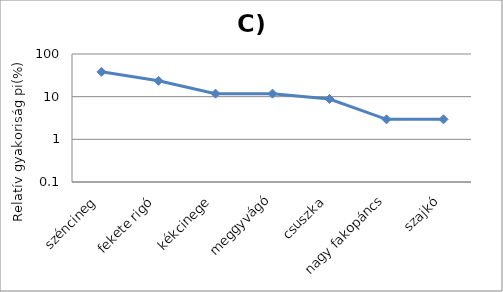
| Category | Series 0 |
|---|---|
| széncineg | 38.235 |
| fekete rigó | 23.529 |
| kékcinege | 11.765 |
| meggyvágó | 11.765 |
| csuszka | 8.824 |
| nagy fakopáncs | 2.941 |
| szajkó | 2.941 |